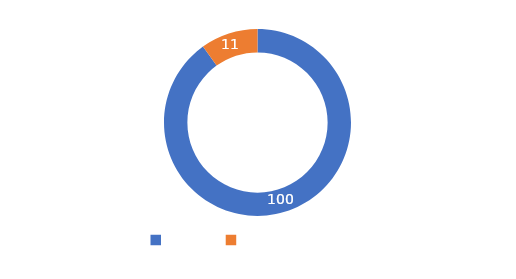
| Category | Series 0 |
|---|---|
| META  | 100 |
| CUMPLIMIENTO | 11 |